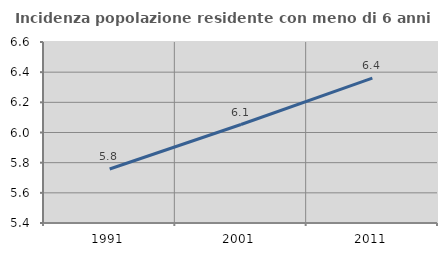
| Category | Incidenza popolazione residente con meno di 6 anni |
|---|---|
| 1991.0 | 5.758 |
| 2001.0 | 6.053 |
| 2011.0 | 6.36 |